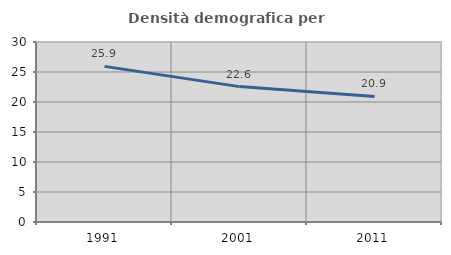
| Category | Densità demografica |
|---|---|
| 1991.0 | 25.937 |
| 2001.0 | 22.564 |
| 2011.0 | 20.92 |